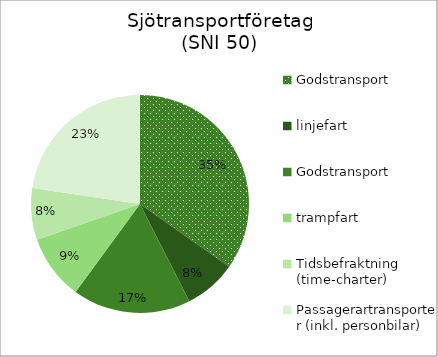
| Category | Godstransport, linjefart Godstransport, trampfart Tidsbefraktning (time-charter) Passagerartransporter (inkl. personbilar) Personaluthyrning för drift och bemanning av andras fartyg Övrigt |
|---|---|
| 0 | 11760.11 |
| 1 | 2630.891 |
| 2 | 5935.182 |
| 3 | 3252.872 |
| 4 | 2596.08 |
| 5 | 7662.77 |